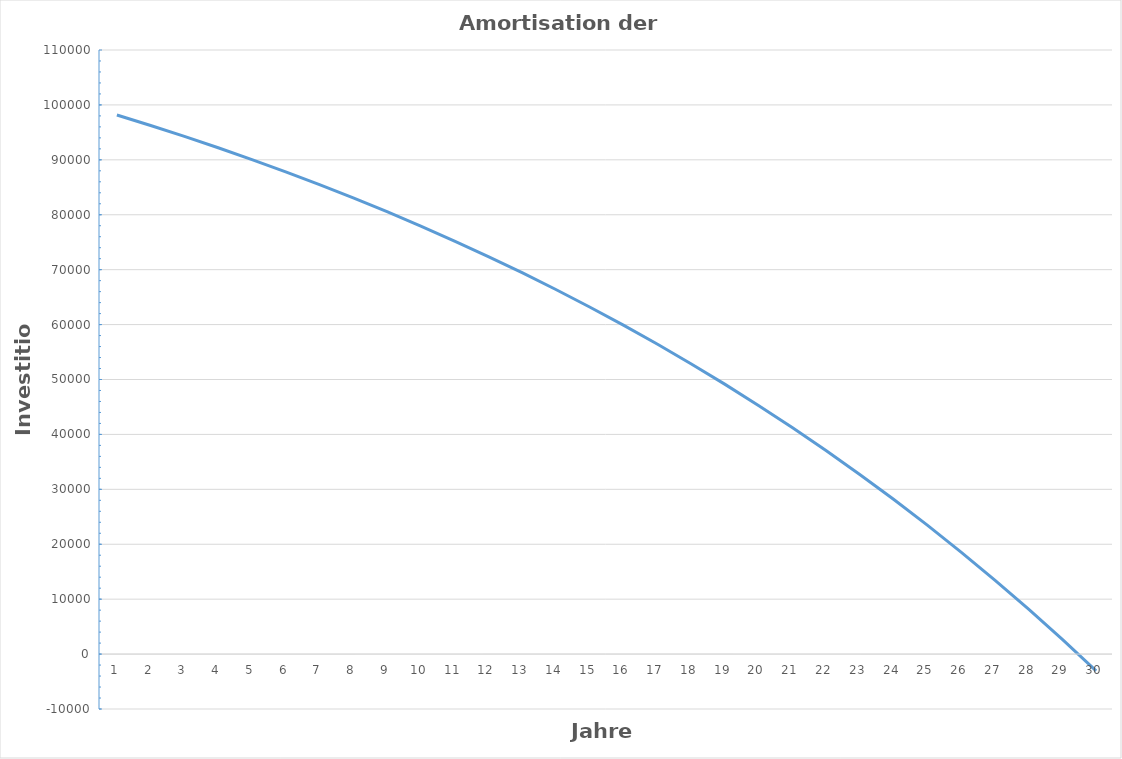
| Category | Amortisation |
|---|---|
| 1.0 | 98162.5 |
| 2.0 | 96251.5 |
| 3.0 | 94264.06 |
| 4.0 | 92197.122 |
| 5.0 | 90047.507 |
| 6.0 | 87811.908 |
| 7.0 | 85486.884 |
| 8.0 | 83068.859 |
| 9.0 | 80554.114 |
| 10.0 | 77938.778 |
| 11.0 | 75218.829 |
| 12.0 | 72390.082 |
| 13.0 | 69448.186 |
| 14.0 | 66388.613 |
| 15.0 | 63206.658 |
| 16.0 | 59897.424 |
| 17.0 | 56455.821 |
| 18.0 | 52876.554 |
| 19.0 | 49154.116 |
| 20.0 | 45282.781 |
| 21.0 | 41256.592 |
| 22.0 | 37069.356 |
| 23.0 | 32714.63 |
| 24.0 | 28185.715 |
| 25.0 | 23475.644 |
| 26.0 | 18577.169 |
| 27.0 | 13482.756 |
| 28.0 | 8184.566 |
| 29.0 | 2674.449 |
| 30.0 | -3056.073 |